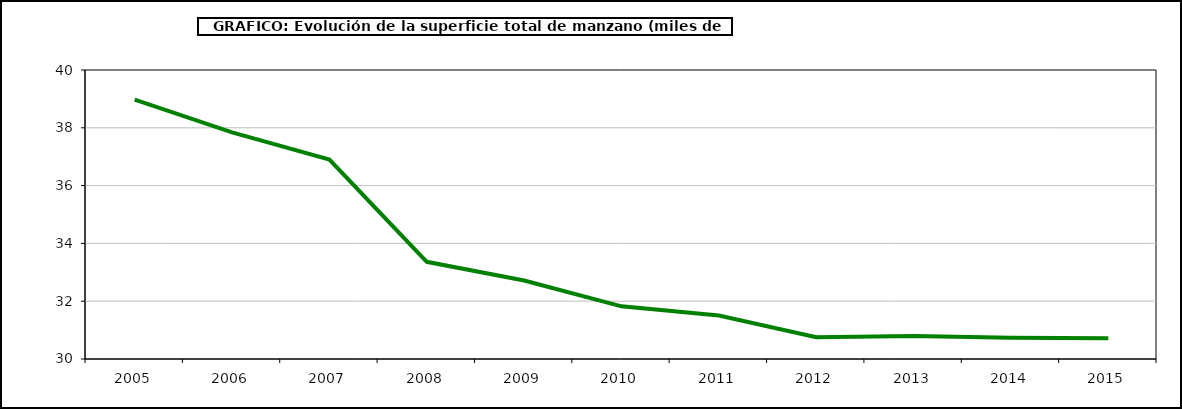
| Category | superficie manzano |
|---|---|
| 2005.0 | 38.974 |
| 2006.0 | 37.844 |
| 2007.0 | 36.902 |
| 2008.0 | 33.362 |
| 2009.0 | 32.715 |
| 2010.0 | 31.822 |
| 2011.0 | 31.507 |
| 2012.0 | 30.753 |
| 2013.0 | 30.794 |
| 2014.0 | 30.739 |
| 2015.0 | 30.721 |